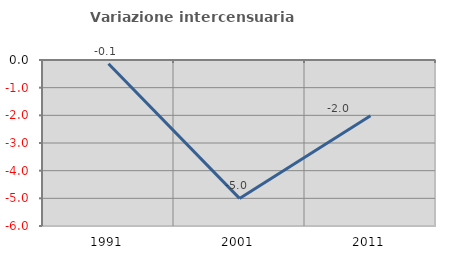
| Category | Variazione intercensuaria annua |
|---|---|
| 1991.0 | -0.133 |
| 2001.0 | -5.003 |
| 2011.0 | -2.019 |